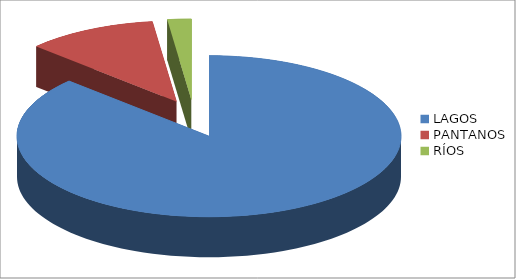
| Category | Series 0 |
|---|---|
| LAGOS | 0.87 |
| PANTANOS | 0.11 |
| RÍOS | 0.02 |